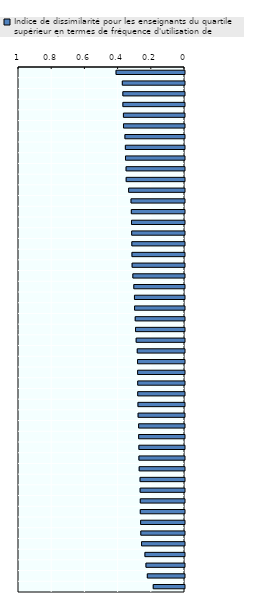
| Category | Indice de dissimilarité pour les enseignants du quartile supérieur en termes de fréquence d'utilisation de pratiques d'activation cognitive |
|---|---|
| Afrique du Sud | 0.412 |
| Viet Nam | 0.375 |
| Arabie Saoudite | 0.371 |
| Chili | 0.371 |
| Brésil | 0.368 |
| Nouvelle Zélande | 0.367 |
| Émirats arabes unis | 0.359 |
| Géorgie | 0.356 |
| Alberta (Canada) | 0.355 |
| États-Unis | 0.352 |
| Estonie | 0.351 |
| Roumanie | 0.337 |
| Pays-Bas | 0.322 |
| Islande | 0.32 |
| Suède | 0.319 |
| Australie* | 0.318 |
| Bulgarie  | 0.317 |
| Israël | 0.316 |
| Angleterre (RU) | 0.316 |
| Lettonie | 0.311 |
| Colombie | 0.305 |
| Kazakhstan | 0.301 |
| République tchèque | 0.301 |
| Moyenne OCDE-31 | 0.297 |
| CABA (Argentine) | 0.295 |
| Hongrie | 0.291 |
| Fédération de Russie | 0.285 |
| Lituanie | 0.283 |
| Belgique | 0.282 |
| Türkiye | 0.282 |
| Italie | 0.282 |
| Finlande | 0.28 |
| Communauté flamande (Belgique) | 0.279 |
| Espagne | 0.276 |
| Communauté française (Belgique) | 0.276 |
| Autriche | 0.275 |
| Mexique | 0.275 |
| Slovénie | 0.273 |
| République slovaque | 0.268 |
| Croatie | 0.267 |
| Shanghai (Chine) | 0.266 |
| Corée | 0.266 |
| Norvège | 0.264 |
| Danemark | 0.263 |
| Japon | 0.259 |
| Singapour | 0.238 |
| Portugal | 0.232 |
| France | 0.224 |
| Malte | 0.188 |